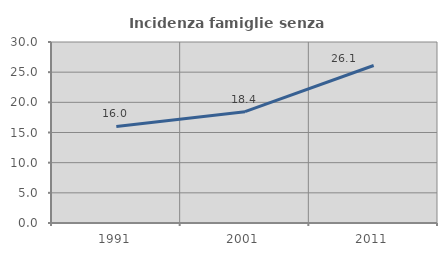
| Category | Incidenza famiglie senza nuclei |
|---|---|
| 1991.0 | 16.005 |
| 2001.0 | 18.449 |
| 2011.0 | 26.111 |